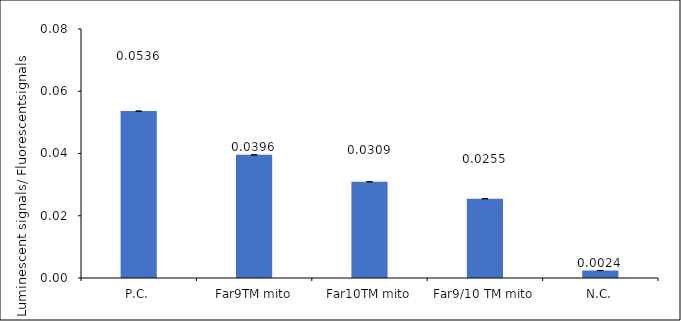
| Category | Series 0 |
|---|---|
| P.C. | 0.054 |
| Far9TM mito | 0.04 |
| Far10TM mito | 0.031 |
| Far9/10 TM mito | 0.025 |
| N.C. | 0.002 |